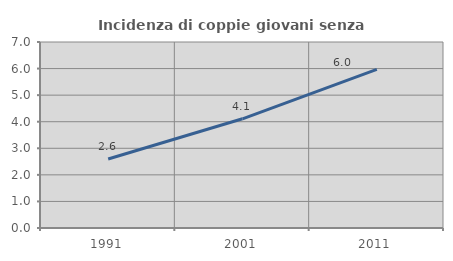
| Category | Incidenza di coppie giovani senza figli |
|---|---|
| 1991.0 | 2.597 |
| 2001.0 | 4.11 |
| 2011.0 | 5.97 |